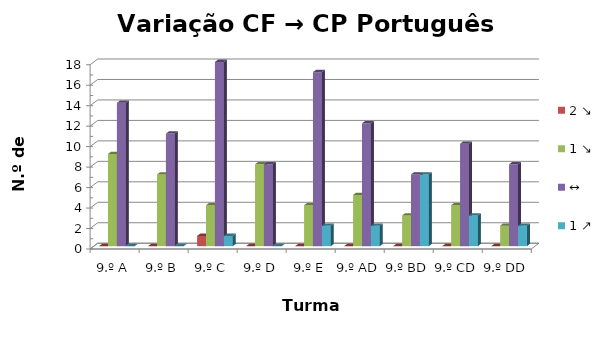
| Category | 2 ↘ | 1 ↘ | ↔ | 1 ↗ |
|---|---|---|---|---|
| 9.º A | 0 | 9 | 14 | 0 |
| 9.º B | 0 | 7 | 11 | 0 |
| 9.º C | 1 | 4 | 18 | 1 |
| 9.º D | 0 | 8 | 8 | 0 |
| 9.º E | 0 | 4 | 17 | 2 |
| 9.º AD | 0 | 5 | 12 | 2 |
| 9.º BD | 0 | 3 | 7 | 7 |
| 9.º CD | 0 | 4 | 10 | 3 |
| 9.º DD | 0 | 2 | 8 | 2 |